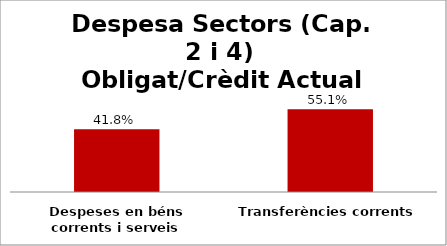
| Category | Series 0 |
|---|---|
| Despeses en béns corrents i serveis | 0.418 |
| Transferències corrents | 0.551 |